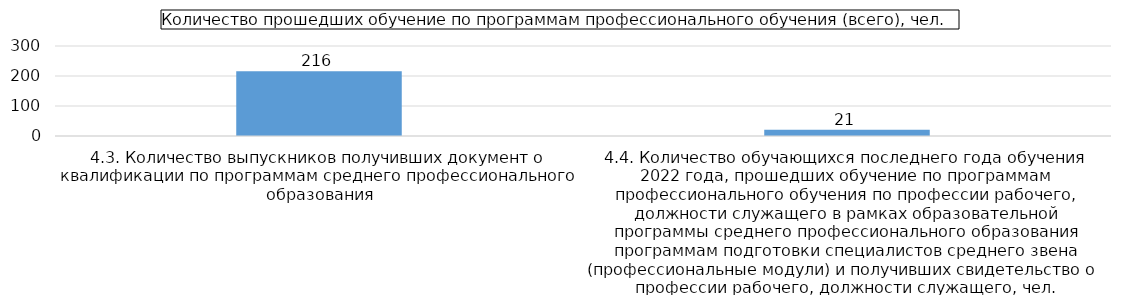
| Category | Series 0 |
|---|---|
| 4.3. Количество выпускников получивших документ о квалификации по программам среднего профессионального образования | 216 |
| 4.4. Количество обучающихся последнего года обучения 2022 года, прошедших обучение по программам профессионального обучения по профессии рабочего, должности служащего в рамках образовательной программы среднего профессионального образования программам под | 21 |